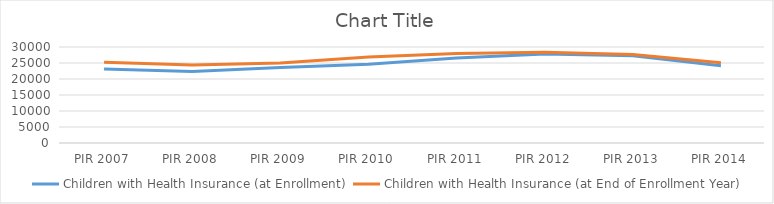
| Category | Children with Health Insurance (at Enrollment) | Children with Health Insurance (at End of Enrollment Year) |
|---|---|---|
| PIR 2007 | 23128 | 25203 |
| PIR 2008 | 22343 | 24351 |
| PIR 2009 | 23607 | 25005 |
| PIR 2010 | 24622 | 26901 |
| PIR 2011 | 26594 | 27962 |
| PIR 2012 | 27808 | 28397 |
| PIR 2013 | 27291 | 27647 |
| PIR 2014 | 24146 | 25093 |